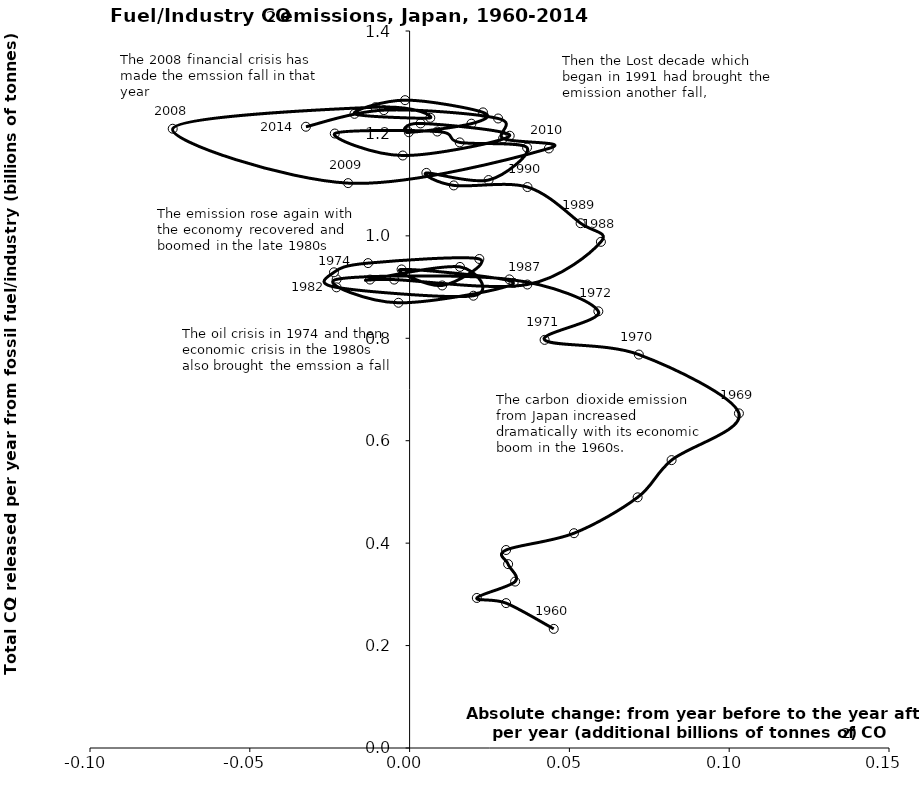
| Category | Series 0 |
|---|---|
| 0.04509834400000001 | 0.233 |
| 0.03019502400000003 | 0.283 |
| 0.021035024000000013 | 0.293 |
| 0.03302179999999999 | 0.325 |
| 0.030823399999999973 | 0.359 |
| 0.030187695999999986 | 0.387 |
| 0.051438895999999984 | 0.419 |
| 0.07135273599999997 | 0.489 |
| 0.08197100800000004 | 0.562 |
| 0.10304450400000004 | 0.653 |
| 0.07173379199999996 | 0.768 |
| 0.042240424 | 0.797 |
| 0.059054520000000055 | 0.853 |
| 0.031224608000000043 | 0.915 |
| -0.022819391999999994 | 0.915 |
| -0.003482632000000041 | 0.869 |
| 0.03254364799999998 | 0.908 |
| -0.0025061760000000266 | 0.934 |
| 0.010195080000000023 | 0.903 |
| 0.02182461600000002 | 0.955 |
| -0.012996208000000009 | 0.947 |
| -0.02366577599999997 | 0.929 |
| -0.022865192000000034 | 0.899 |
| 0.019948647999999958 | 0.883 |
| 0.015766192000000012 | 0.939 |
| -0.012387983999999963 | 0.915 |
| -0.004827320000000024 | 0.915 |
| 0.036843351999999996 | 0.905 |
| 0.05985876800000001 | 0.988 |
| 0.05350539200000004 | 1.025 |
| 0.03688548800000002 | 1.095 |
| 0.013822439999999991 | 1.098 |
| 0.0052486800000000056 | 1.123 |
| 0.02471367999999996 | 1.109 |
| 0.03674991999999999 | 1.172 |
| 0.015674591999999987 | 1.182 |
| 0.008663528000000031 | 1.204 |
| -0.023411128000000003 | 1.2 |
| -0.002134280000000044 | 1.157 |
| 0.03132353600000004 | 1.196 |
| 0.0034276720000000482 | 1.22 |
| -0.0002399920000000222 | 1.202 |
| 0.019342256000000058 | 1.219 |
| 0.022962287999999997 | 1.241 |
| -0.0014179680000000472 | 1.265 |
| -0.01724278400000001 | 1.238 |
| 0.006481615999999968 | 1.23 |
| -0.010671399999999998 | 1.251 |
| -0.07411905600000002 | 1.209 |
| -0.01923966399999999 | 1.103 |
| 0.04356679200000002 | 1.171 |
| 0.029247880000000004 | 1.19 |
| 0.027698007999999996 | 1.229 |
| -0.008053472000000061 | 1.245 |
| -0.032441056000000135 | 1.213 |